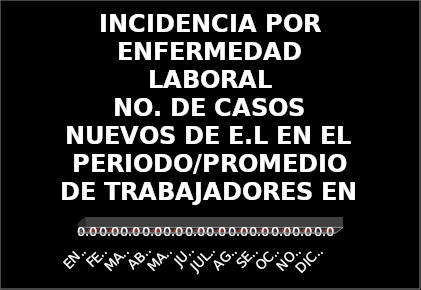
| Category | INCIDENCIA POR ENFERMEDAD LABORAL
NO. DE CASOS NUEVOS DE E.L EN EL PERIODO/PROMEDIO DE TRABAJADORES EN EL PERIODO*100.000 
 |
|---|---|
| ENERO | 0 |
| FEBRERO | 0 |
| MARZO | 0 |
| ABRIL | 0 |
| MAYO | 0 |
| JUNIO | 0 |
| JULIO | 0 |
| AGOSTO | 0 |
| SEPTIEMBRE | 0 |
| OCTUBRE | 0 |
| NOVIEMBRE | 0 |
| DICIEMBRE | 0 |